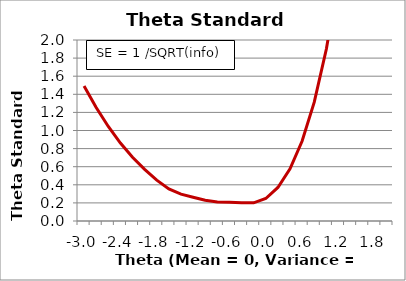
| Category | Theta Standard Error |
|---|---|
| -3.0 | 1.492 |
| -2.8 | 1.255 |
| -2.6 | 1.044 |
| -2.4 | 0.861 |
| -2.2 | 0.704 |
| -2.0 | 0.57 |
| -1.8 | 0.451 |
| -1.6 | 0.355 |
| -1.4 | 0.296 |
| -1.2 | 0.262 |
| -1.0 | 0.229 |
| -0.8 | 0.211 |
| -0.6 | 0.208 |
| -0.4 | 0.201 |
| -0.2 | 0.201 |
| 0.0 | 0.249 |
| 0.2 | 0.371 |
| 0.4 | 0.577 |
| 0.6 | 0.884 |
| 0.8 | 1.313 |
| 1.0 | 1.9 |
| 1.2 | 2.687 |
| 1.4 | 3.73 |
| 1.6 | 5.091 |
| 1.8 | 6.844 |
| 2.0 | 9.068 |